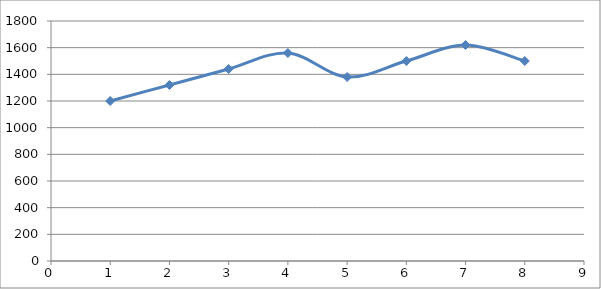
| Category | Series 0 |
|---|---|
| 1.0 | 1200 |
| 2.0 | 1320 |
| 3.0 | 1440 |
| 4.0 | 1560 |
| 5.0 | 1380 |
| 6.0 | 1500 |
| 7.0 | 1620 |
| 8.0 | 1500 |